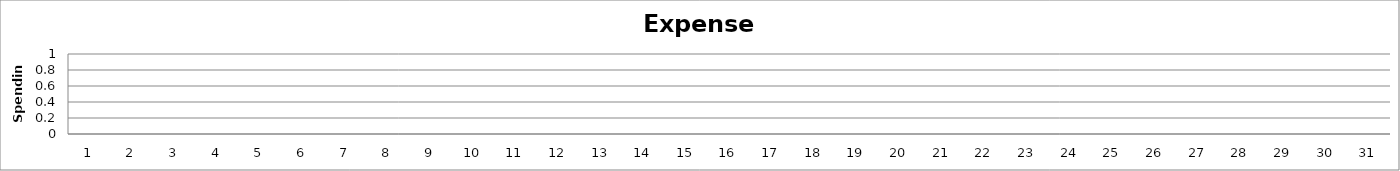
| Category | Spending |
|---|---|
| 1.0 | 0 |
| 2.0 | 0 |
| 3.0 | 0 |
| 4.0 | 0 |
| 5.0 | 0 |
| 6.0 | 0 |
| 7.0 | 0 |
| 8.0 | 0 |
| 9.0 | 0 |
| 10.0 | 0 |
| 11.0 | 0 |
| 12.0 | 0 |
| 13.0 | 0 |
| 14.0 | 0 |
| 15.0 | 0 |
| 16.0 | 0 |
| 17.0 | 0 |
| 18.0 | 0 |
| 19.0 | 0 |
| 20.0 | 0 |
| 21.0 | 0 |
| 22.0 | 0 |
| 23.0 | 0 |
| 24.0 | 0 |
| 25.0 | 0 |
| 26.0 | 0 |
| 27.0 | 0 |
| 28.0 | 0 |
| 29.0 | 0 |
| 30.0 | 0 |
| 31.0 | 0 |